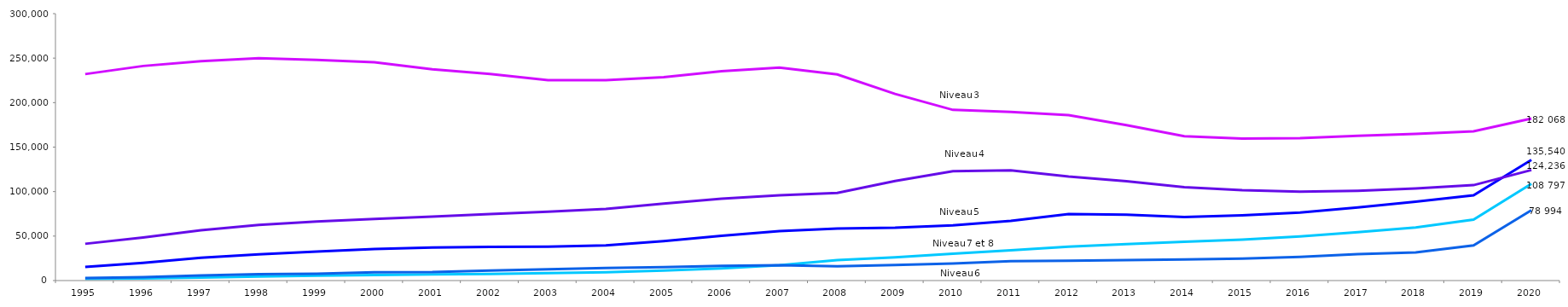
| Category | Niveaux 7 et 8 | Niveau 6 | Niveau 5 | Niveau 4 | Niveau 3 |
|---|---|---|---|---|---|
| 1995 | 1948 | 2829 | 15273 | 41327 | 232062 |
| 1996 | 2441 | 3916 | 19952 | 48438 | 241182 |
| 1997 | 3250 | 5768 | 25603 | 56579 | 246490 |
| 1998 | 4436 | 7143 | 29581 | 62622 | 249850 |
| 1999 | 5397 | 7780 | 32507 | 66469 | 248084 |
| 2000 | 6185 | 9448 | 35553 | 69355 | 245333 |
| 2001 | 6852 | 9568 | 37234 | 71828 | 237446 |
| 2002 | 7514 | 11243 | 37751 | 74802 | 232166 |
| 2003 | 8378 | 12674 | 38217 | 77362 | 225335 |
| 2004 | 9407 | 14124 | 39560 | 80623 | 225274 |
| 2005 | 11341 | 15063 | 44233 | 86609 | 228613 |
| 2006 | 13690 | 16461 | 50316 | 91951 | 235391 |
| 2007 | 17340 | 17198 | 55577 | 95753 | 239294 |
| 2008 | 22928 | 16021 | 58572 | 98470 | 231659 |
| 2009 | 26156 | 17387 | 59532 | 111900 | 209767 |
| 2010 | 30142 | 19189 | 62074 | 123018 | 191857 |
| 2011 | 33931 | 21762 | 67193 | 123888 | 189560 |
| 2012 | 38182 | 22321 | 74868 | 116897 | 185875 |
| 2013 | 41027 | 22937 | 74048 | 111682 | 174654 |
| 2014 | 43614 | 23743 | 71419 | 104880 | 162226 |
| 2015 | 46041 | 24655 | 73317 | 101582 | 159610 |
| 2016 | 49523 | 26605 | 76326 | 99814 | 159998 |
| 2017 | 54364 | 29740 | 82200 | 100952 | 162650 |
| 2018 | 59667 | 31582 | 88551 | 103453 | 164874 |
| 2019 | 68480 | 39506 | 95860 | 107255 | 167702 |
| 2020 | 108797 | 78994 | 135540 | 124236 | 182068 |